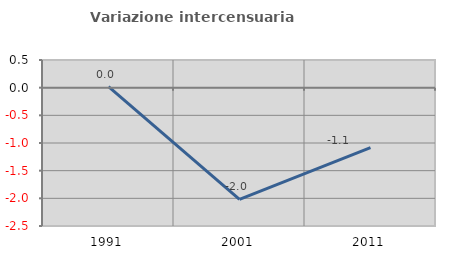
| Category | Variazione intercensuaria annua |
|---|---|
| 1991.0 | 0.021 |
| 2001.0 | -2.021 |
| 2011.0 | -1.084 |